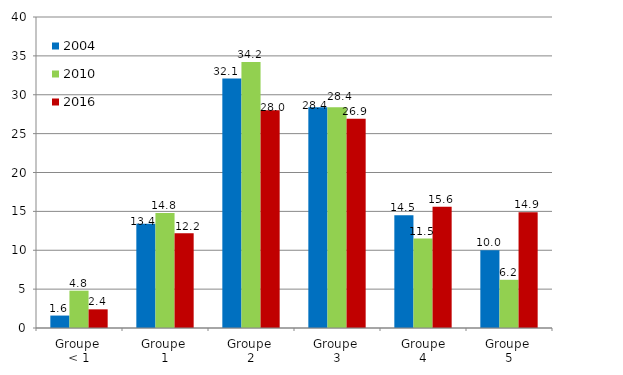
| Category | 2004 | 2010 | 2016 |
|---|---|---|---|
| Groupe 
< 1 | 1.6 | 4.8 | 2.4 |
| Groupe 
1 | 13.4 | 14.8 | 12.2 |
| Groupe 
2 | 32.1 | 34.2 | 28 |
| Groupe 
3 | 28.4 | 28.4 | 26.9 |
| Groupe
4 | 14.5 | 11.5 | 15.6 |
| Groupe 
5 | 10 | 6.2 | 14.9 |